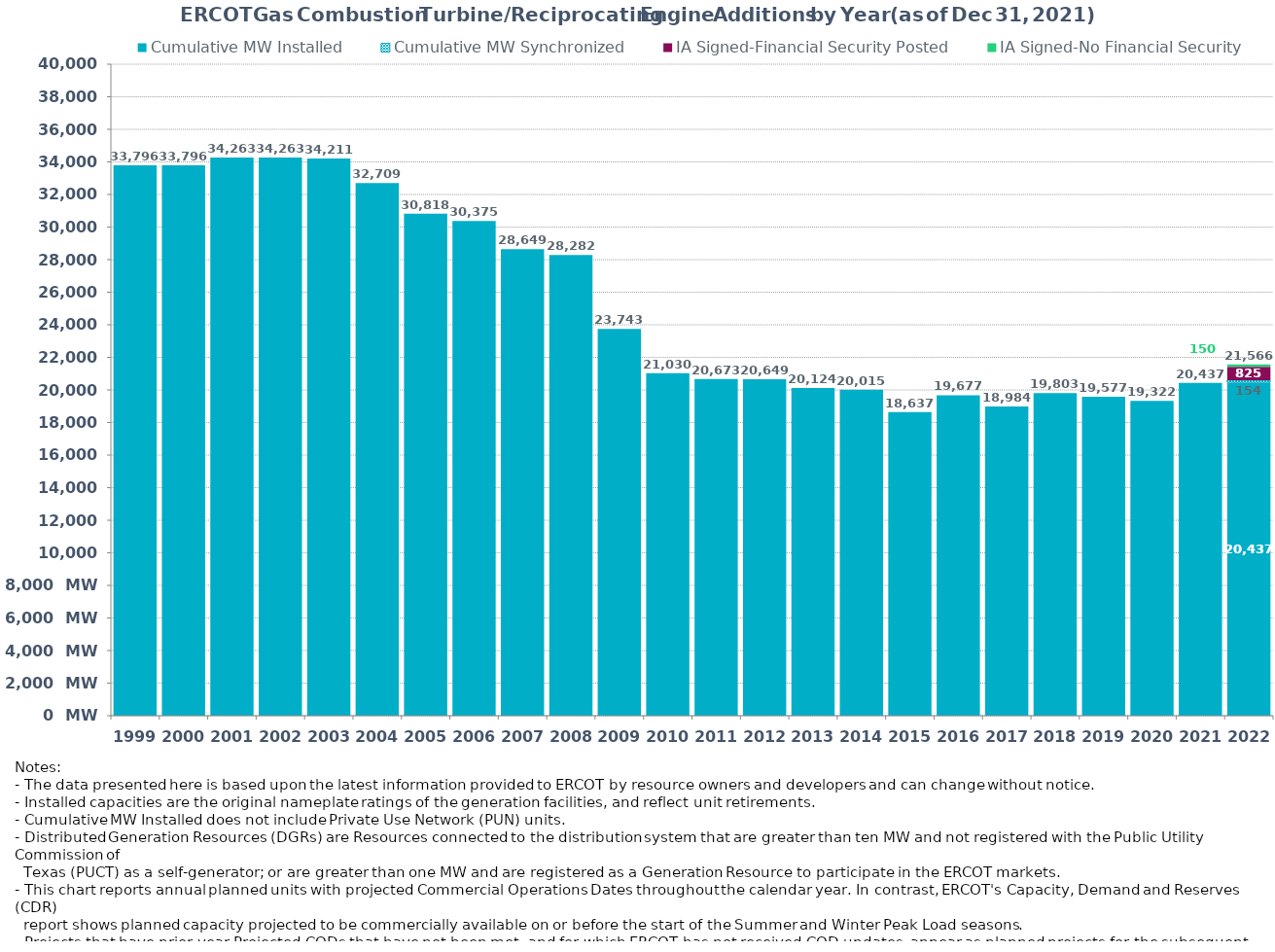
| Category | Cumulative MW Installed | Cumulative MW Synchronized | IA Signed-Financial Security Posted  | IA Signed-No Financial Security  | Other Planned | Cumulative Installed and Planned |
|---|---|---|---|---|---|---|
| 1999.0 | 33796.03 | 0 | 0 | 0 | 0 | 33796.03 |
| 2000.0 | 33796.03 | 0 | 0 | 0 | 0 | 33796.03 |
| 2001.0 | 34262.59 | 0 | 0 | 0 | 0 | 34262.59 |
| 2002.0 | 34262.59 | 0 | 0 | 0 | 0 | 34262.59 |
| 2003.0 | 34210.59 | 0 | 0 | 0 | 0 | 34210.59 |
| 2004.0 | 32708.69 | 0 | 0 | 0 | 0 | 32708.69 |
| 2005.0 | 30818 | 0 | 0 | 0 | 0 | 30818 |
| 2006.0 | 30375 | 0 | 0 | 0 | 0 | 30375 |
| 2007.0 | 28649 | 0 | 0 | 0 | 0 | 28649 |
| 2008.0 | 28282 | 0 | 0 | 0 | 0 | 28282 |
| 2009.0 | 23743.29 | 0 | 0 | 0 | 0 | 23743.29 |
| 2010.0 | 21030.17 | 0 | 0 | 0 | 0 | 21030.17 |
| 2011.0 | 20673.47 | 0 | 0 | 0 | 0 | 20673.47 |
| 2012.0 | 20649.47 | 0 | 0 | 0 | 0 | 20649.47 |
| 2013.0 | 20124.47 | 0 | 0 | 0 | 0 | 20124.47 |
| 2014.0 | 20015.47 | 0 | 0 | 0 | 0 | 20015.47 |
| 2015.0 | 18636.67 | 0 | 0 | 0 | 0 | 18636.67 |
| 2016.0 | 19677.05 | 0 | 0 | 0 | 0 | 19677.05 |
| 2017.0 | 18984.19 | 0 | 0 | 0 | 0 | 18984.19 |
| 2018.0 | 19803.35 | 0 | 0 | 0 | 0 | 19803.35 |
| 2019.0 | 19577.05 | 0 | 0 | 0 | 0 | 19577.05 |
| 2020.0 | 19322.4 | 0 | 0 | 0 | 0 | 19322.4 |
| 2021.0 | 20437.34 | 0 | 0 | 0 | 0 | 20437.34 |
| 2022.0 | 20437.34 | 154 | 825 | 150 | 0 | 21566.34 |